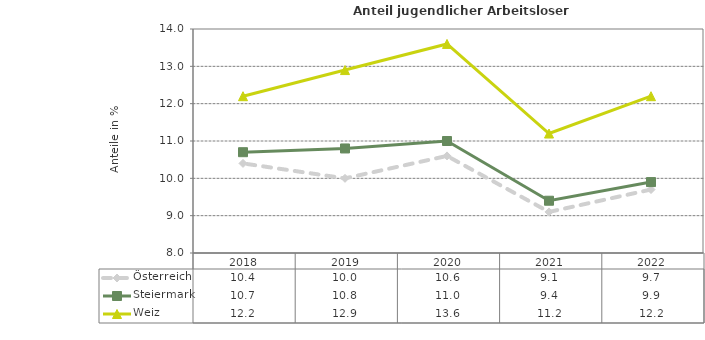
| Category | Österreich | Steiermark | Weiz |
|---|---|---|---|
| 2022.0 | 9.7 | 9.9 | 12.2 |
| 2021.0 | 9.1 | 9.4 | 11.2 |
| 2020.0 | 10.6 | 11 | 13.6 |
| 2019.0 | 10 | 10.8 | 12.9 |
| 2018.0 | 10.4 | 10.7 | 12.2 |